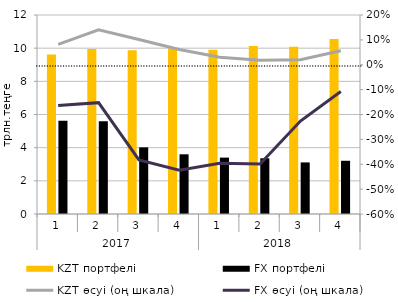
| Category | KZT портфелі | FX портфелі |
|---|---|---|
| 0 | 9.62 | 5.63 |
| 1 | 9.95 | 5.59 |
| 2 | 9.88 | 4.02 |
| 3 | 9.99 | 3.6 |
| 4 | 9.9 | 3.4 |
| 5 | 10.13 | 3.36 |
| 6 | 10.08 | 3.11 |
| 7 | 10.55 | 3.21 |